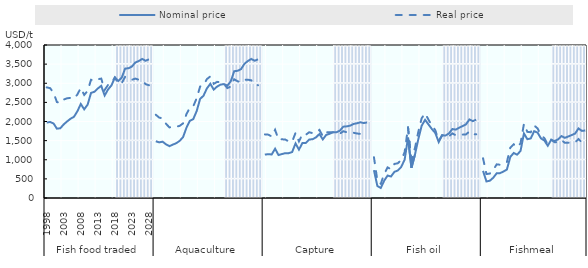
| Category | Projected1 | Projected2 | Projected3 | Projected4 | Projected5 | Projected6 | Projected7 | Projected8 |
|---|---|---|---|---|---|---|---|---|
| 0 | 0 | 0 | 0 | 0 | 0 | 0 | 0 | 0 |
| 1 | 0 | 0 | 0 | 0 | 0 | 0 | 0 | 0 |
| 2 | 0 | 0 | 0 | 0 | 0 | 0 | 0 | 0 |
| 3 | 0 | 0 | 0 | 0 | 0 | 0 | 0 | 0 |
| 4 | 0 | 0 | 0 | 0 | 0 | 0 | 0 | 0 |
| 5 | 0 | 0 | 0 | 0 | 0 | 0 | 0 | 0 |
| 6 | 0 | 0 | 0 | 0 | 0 | 0 | 0 | 0 |
| 7 | 0 | 0 | 0 | 0 | 0 | 0 | 0 | 0 |
| 8 | 0 | 0 | 0 | 0 | 0 | 0 | 0 | 0 |
| 9 | 0 | 0 | 0 | 0 | 0 | 0 | 0 | 0 |
| 10 | 0 | 0 | 0 | 0 | 0 | 0 | 0 | 0 |
| 11 | 0 | 0 | 0 | 0 | 0 | 0 | 0 | 0 |
| 12 | 0 | 0 | 0 | 0 | 0 | 0 | 0 | 0 |
| 13 | 0 | 0 | 0 | 0 | 0 | 0 | 0 | 0 |
| 14 | 0 | 0 | 0 | 0 | 0 | 0 | 0 | 0 |
| 15 | 0 | 0 | 0 | 0 | 0 | 0 | 0 | 0 |
| 16 | 0 | 0 | 0 | 0 | 0 | 0 | 0 | 0 |
| 17 | 0 | 0 | 0 | 0 | 0 | 0 | 0 | 0 |
| 18 | 0 | 0 | 0 | 0 | 0 | 0 | 0 | 0 |
| 19 | 0 | 0 | 0 | 0 | 0 | 0 | 0 | 0 |
| 20 | 0 | 0 | 0 | 0 | 0 | 0 | 0 | 0 |
| 21 | 1 | 1 | 1 | 1 | 1 | 1 | 1 | 0.95 |
| 22 | 1 | 1 | 1 | 1 | 1 | 1 | 1 | 0.95 |
| 23 | 1 | 1 | 1 | 1 | 1 | 1 | 1 | 0.95 |
| 24 | 1 | 1 | 1 | 1 | 1 | 1 | 1 | 0.95 |
| 25 | 1 | 1 | 1 | 1 | 1 | 1 | 1 | 0.95 |
| 26 | 1 | 1 | 1 | 1 | 1 | 1 | 1 | 0.95 |
| 27 | 1 | 1 | 1 | 1 | 1 | 1 | 1 | 0.95 |
| 28 | 1 | 1 | 1 | 1 | 1 | 1 | 1 | 0.95 |
| 29 | 1 | 1 | 1 | 1 | 1 | 1 | 1 | 0.95 |
| 30 | 1 | 1 | 1 | 1 | 1 | 1 | 1 | 0.95 |
| 31 | 1 | 1 | 1 | 1 | 1 | 1 | 1 | 0.95 |
| 32 | 0 | 0 | 0 | 0 | 0 | 0 | 0 | 0 |
| 33 | 0 | 0 | 0 | 0 | 0 | 0 | 0 | 0 |
| 34 | 0 | 0 | 0 | 0 | 0 | 0 | 0 | 0 |
| 35 | 0 | 0 | 0 | 0 | 0 | 0 | 0 | 0 |
| 36 | 0 | 0 | 0 | 0 | 0 | 0 | 0 | 0 |
| 37 | 0 | 0 | 0 | 0 | 0 | 0 | 0 | 0 |
| 38 | 0 | 0 | 0 | 0 | 0 | 0 | 0 | 0 |
| 39 | 0 | 0 | 0 | 0 | 0 | 0 | 0 | 0 |
| 40 | 0 | 0 | 0 | 0 | 0 | 0 | 0 | 0 |
| 41 | 0 | 0 | 0 | 0 | 0 | 0 | 0 | 0 |
| 42 | 0 | 0 | 0 | 0 | 0 | 0 | 0 | 0 |
| 43 | 0 | 0 | 0 | 0 | 0 | 0 | 0 | 0 |
| 44 | 0 | 0 | 0 | 0 | 0 | 0 | 0 | 0 |
| 45 | 0 | 0 | 0 | 0 | 0 | 0 | 0 | 0 |
| 46 | 0 | 0 | 0 | 0 | 0 | 0 | 0 | 0 |
| 47 | 0 | 0 | 0 | 0 | 0 | 0 | 0 | 0 |
| 48 | 0 | 0 | 0 | 0 | 0 | 0 | 0 | 0 |
| 49 | 0 | 0 | 0 | 0 | 0 | 0 | 0 | 0 |
| 50 | 0 | 0 | 0 | 0 | 0 | 0 | 0 | 0 |
| 51 | 0 | 0 | 0 | 0 | 0 | 0 | 0 | 0 |
| 52 | 0 | 0 | 0 | 0 | 0 | 0 | 0 | 0 |
| 53 | 1 | 1 | 1 | 1 | 1 | 1 | 1 | 0.95 |
| 54 | 1 | 1 | 1 | 1 | 1 | 1 | 1 | 0.95 |
| 55 | 1 | 1 | 1 | 1 | 1 | 1 | 1 | 0.95 |
| 56 | 1 | 1 | 1 | 1 | 1 | 1 | 1 | 0.95 |
| 57 | 1 | 1 | 1 | 1 | 1 | 1 | 1 | 0.95 |
| 58 | 1 | 1 | 1 | 1 | 1 | 1 | 1 | 0.95 |
| 59 | 1 | 1 | 1 | 1 | 1 | 1 | 1 | 0.95 |
| 60 | 1 | 1 | 1 | 1 | 1 | 1 | 1 | 0.95 |
| 61 | 1 | 1 | 1 | 1 | 1 | 1 | 1 | 0.95 |
| 62 | 1 | 1 | 1 | 1 | 1 | 1 | 1 | 0.95 |
| 63 | 1 | 1 | 1 | 1 | 1 | 1 | 1 | 0.95 |
| 64 | 0 | 0 | 0 | 0 | 0 | 0 | 0 | 0 |
| 65 | 0 | 0 | 0 | 0 | 0 | 0 | 0 | 0 |
| 66 | 0 | 0 | 0 | 0 | 0 | 0 | 0 | 0 |
| 67 | 0 | 0 | 0 | 0 | 0 | 0 | 0 | 0 |
| 68 | 0 | 0 | 0 | 0 | 0 | 0 | 0 | 0 |
| 69 | 0 | 0 | 0 | 0 | 0 | 0 | 0 | 0 |
| 70 | 0 | 0 | 0 | 0 | 0 | 0 | 0 | 0 |
| 71 | 0 | 0 | 0 | 0 | 0 | 0 | 0 | 0 |
| 72 | 0 | 0 | 0 | 0 | 0 | 0 | 0 | 0 |
| 73 | 0 | 0 | 0 | 0 | 0 | 0 | 0 | 0 |
| 74 | 0 | 0 | 0 | 0 | 0 | 0 | 0 | 0 |
| 75 | 0 | 0 | 0 | 0 | 0 | 0 | 0 | 0 |
| 76 | 0 | 0 | 0 | 0 | 0 | 0 | 0 | 0 |
| 77 | 0 | 0 | 0 | 0 | 0 | 0 | 0 | 0 |
| 78 | 0 | 0 | 0 | 0 | 0 | 0 | 0 | 0 |
| 79 | 0 | 0 | 0 | 0 | 0 | 0 | 0 | 0 |
| 80 | 0 | 0 | 0 | 0 | 0 | 0 | 0 | 0 |
| 81 | 0 | 0 | 0 | 0 | 0 | 0 | 0 | 0 |
| 82 | 0 | 0 | 0 | 0 | 0 | 0 | 0 | 0 |
| 83 | 0 | 0 | 0 | 0 | 0 | 0 | 0 | 0 |
| 84 | 0 | 0 | 0 | 0 | 0 | 0 | 0 | 0 |
| 85 | 1 | 1 | 1 | 1 | 1 | 1 | 1 | 0.95 |
| 86 | 1 | 1 | 1 | 1 | 1 | 1 | 1 | 0.95 |
| 87 | 1 | 1 | 1 | 1 | 1 | 1 | 1 | 0.95 |
| 88 | 1 | 1 | 1 | 1 | 1 | 1 | 1 | 0.95 |
| 89 | 1 | 1 | 1 | 1 | 1 | 1 | 1 | 0.95 |
| 90 | 1 | 1 | 1 | 1 | 1 | 1 | 1 | 0.95 |
| 91 | 1 | 1 | 1 | 1 | 1 | 1 | 1 | 0.95 |
| 92 | 1 | 1 | 1 | 1 | 1 | 1 | 1 | 0.95 |
| 93 | 1 | 1 | 1 | 1 | 1 | 1 | 1 | 0.95 |
| 94 | 1 | 1 | 1 | 1 | 1 | 1 | 1 | 0.95 |
| 95 | 1 | 1 | 1 | 1 | 1 | 1 | 1 | 0.95 |
| 96 | 0 | 0 | 0 | 0 | 0 | 0 | 0 | 0 |
| 97 | 0 | 0 | 0 | 0 | 0 | 0 | 0 | 0 |
| 98 | 0 | 0 | 0 | 0 | 0 | 0 | 0 | 0 |
| 99 | 0 | 0 | 0 | 0 | 0 | 0 | 0 | 0 |
| 100 | 0 | 0 | 0 | 0 | 0 | 0 | 0 | 0 |
| 101 | 0 | 0 | 0 | 0 | 0 | 0 | 0 | 0 |
| 102 | 0 | 0 | 0 | 0 | 0 | 0 | 0 | 0 |
| 103 | 0 | 0 | 0 | 0 | 0 | 0 | 0 | 0 |
| 104 | 0 | 0 | 0 | 0 | 0 | 0 | 0 | 0 |
| 105 | 0 | 0 | 0 | 0 | 0 | 0 | 0 | 0 |
| 106 | 0 | 0 | 0 | 0 | 0 | 0 | 0 | 0 |
| 107 | 0 | 0 | 0 | 0 | 0 | 0 | 0 | 0 |
| 108 | 0 | 0 | 0 | 0 | 0 | 0 | 0 | 0 |
| 109 | 0 | 0 | 0 | 0 | 0 | 0 | 0 | 0 |
| 110 | 0 | 0 | 0 | 0 | 0 | 0 | 0 | 0 |
| 111 | 0 | 0 | 0 | 0 | 0 | 0 | 0 | 0 |
| 112 | 0 | 0 | 0 | 0 | 0 | 0 | 0 | 0 |
| 113 | 0 | 0 | 0 | 0 | 0 | 0 | 0 | 0 |
| 114 | 0 | 0 | 0 | 0 | 0 | 0 | 0 | 0 |
| 115 | 0 | 0 | 0 | 0 | 0 | 0 | 0 | 0 |
| 116 | 0 | 0 | 0 | 0 | 0 | 0 | 0 | 0 |
| 117 | 1 | 1 | 1 | 1 | 1 | 1 | 1 | 0.95 |
| 118 | 1 | 1 | 1 | 1 | 1 | 1 | 1 | 0.95 |
| 119 | 1 | 1 | 1 | 1 | 1 | 1 | 1 | 0.95 |
| 120 | 1 | 1 | 1 | 1 | 1 | 1 | 1 | 0.95 |
| 121 | 1 | 1 | 1 | 1 | 1 | 1 | 1 | 0.95 |
| 122 | 1 | 1 | 1 | 1 | 1 | 1 | 1 | 0.95 |
| 123 | 1 | 1 | 1 | 1 | 1 | 1 | 1 | 0.95 |
| 124 | 1 | 1 | 1 | 1 | 1 | 1 | 1 | 0.95 |
| 125 | 1 | 1 | 1 | 1 | 1 | 1 | 1 | 0.95 |
| 126 | 1 | 1 | 1 | 1 | 1 | 1 | 1 | 0.95 |
| 127 | 1 | 1 | 1 | 1 | 1 | 1 | 1 | 0.95 |
| 128 | 0 | 0 | 0 | 0 | 0 | 0 | 0 | 0 |
| 129 | 0 | 0 | 0 | 0 | 0 | 0 | 0 | 0 |
| 130 | 0 | 0 | 0 | 0 | 0 | 0 | 0 | 0 |
| 131 | 0 | 0 | 0 | 0 | 0 | 0 | 0 | 0 |
| 132 | 0 | 0 | 0 | 0 | 0 | 0 | 0 | 0 |
| 133 | 0 | 0 | 0 | 0 | 0 | 0 | 0 | 0 |
| 134 | 0 | 0 | 0 | 0 | 0 | 0 | 0 | 0 |
| 135 | 0 | 0 | 0 | 0 | 0 | 0 | 0 | 0 |
| 136 | 0 | 0 | 0 | 0 | 0 | 0 | 0 | 0 |
| 137 | 0 | 0 | 0 | 0 | 0 | 0 | 0 | 0 |
| 138 | 0 | 0 | 0 | 0 | 0 | 0 | 0 | 0 |
| 139 | 0 | 0 | 0 | 0 | 0 | 0 | 0 | 0 |
| 140 | 0 | 0 | 0 | 0 | 0 | 0 | 0 | 0 |
| 141 | 0 | 0 | 0 | 0 | 0 | 0 | 0 | 0 |
| 142 | 0 | 0 | 0 | 0 | 0 | 0 | 0 | 0 |
| 143 | 0 | 0 | 0 | 0 | 0 | 0 | 0 | 0 |
| 144 | 0 | 0 | 0 | 0 | 0 | 0 | 0 | 0 |
| 145 | 0 | 0 | 0 | 0 | 0 | 0 | 0 | 0 |
| 146 | 0 | 0 | 0 | 0 | 0 | 0 | 0 | 0 |
| 147 | 0 | 0 | 0 | 0 | 0 | 0 | 0 | 0 |
| 148 | 0 | 0 | 0 | 0 | 0 | 0 | 0 | 0 |
| 149 | 1 | 1 | 1 | 1 | 1 | 1 | 1 | 0.95 |
| 150 | 1 | 1 | 1 | 1 | 1 | 1 | 1 | 0.95 |
| 151 | 1 | 1 | 1 | 1 | 1 | 1 | 1 | 0.95 |
| 152 | 1 | 1 | 1 | 1 | 1 | 1 | 1 | 0.95 |
| 153 | 1 | 1 | 1 | 1 | 1 | 1 | 1 | 0.95 |
| 154 | 1 | 1 | 1 | 1 | 1 | 1 | 1 | 0.95 |
| 155 | 1 | 1 | 1 | 1 | 1 | 1 | 1 | 0.95 |
| 156 | 1 | 1 | 1 | 1 | 1 | 1 | 1 | 0.95 |
| 157 | 1 | 1 | 1 | 1 | 1 | 1 | 1 | 0.95 |
| 158 | 1 | 1 | 1 | 1 | 1 | 1 | 1 | 0.95 |